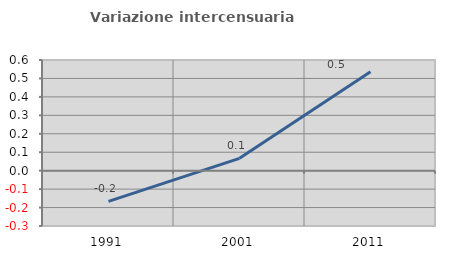
| Category | Variazione intercensuaria annua |
|---|---|
| 1991.0 | -0.166 |
| 2001.0 | 0.067 |
| 2011.0 | 0.537 |